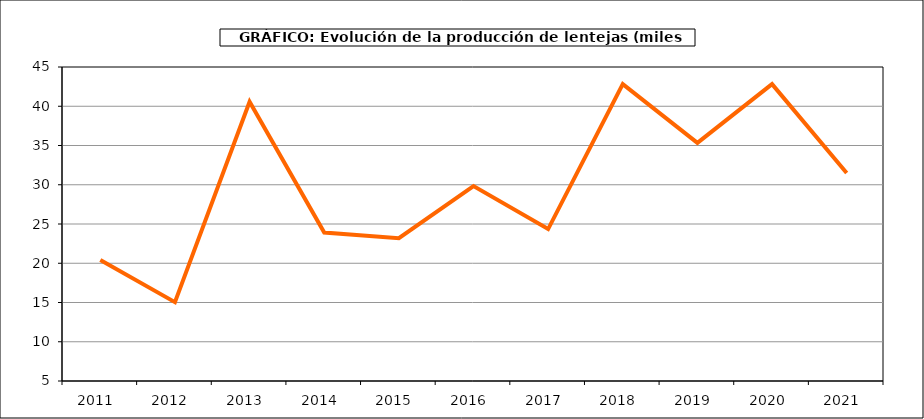
| Category | Producción |
|---|---|
| 2011.0 | 20.426 |
| 2012.0 | 15.046 |
| 2013.0 | 40.57 |
| 2014.0 | 23.905 |
| 2015.0 | 23.193 |
| 2016.0 | 29.827 |
| 2017.0 | 24.357 |
| 2018.0 | 42.827 |
| 2019.0 | 35.333 |
| 2020.0 | 42.823 |
| 2021.0 | 31.498 |